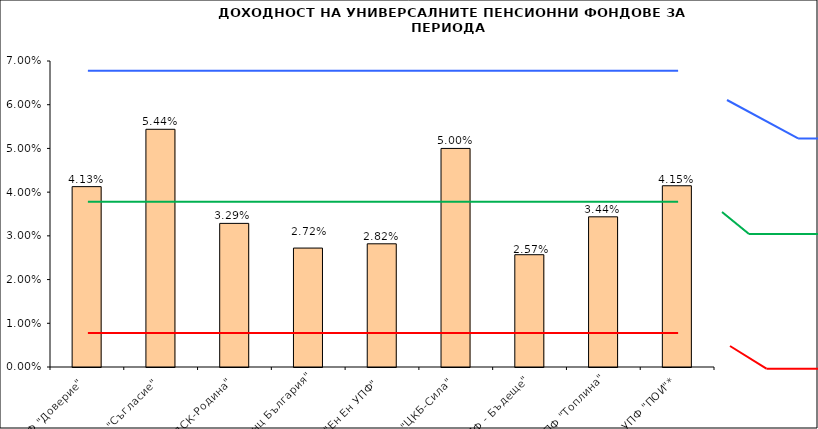
| Category | Series 0 |
|---|---|
| УПФ "Доверие"  | 0.041 |
| УПФ "Съгласие"  | 0.054 |
| УПФ "ДСК-Родина"  | 0.033 |
| "ЗУПФ Алианц България" | 0.027 |
| "Eн Ен УПФ"  | 0.028 |
| УПФ "ЦКБ-Сила"  | 0.05 |
| "УПФ - Бъдеще" | 0.026 |
| УПФ "Топлина" | 0.034 |
| УПФ "ПОИ"* | 0.041 |